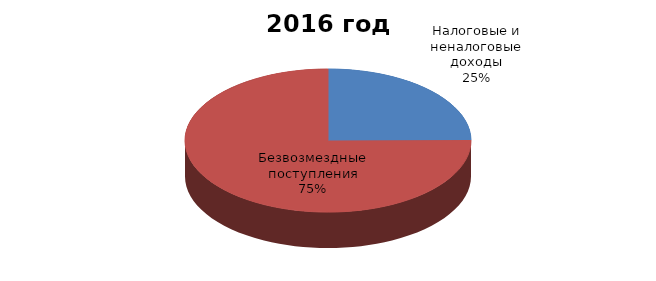
| Category | 2016 год |
|---|---|
| Налоговые и неналоговые доходы | 414788.7 |
| Безвозмездные поступления | 1250490.4 |